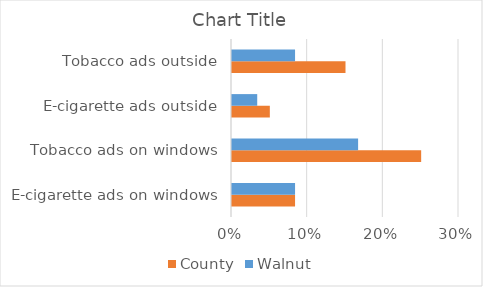
| Category | County | Walnut |
|---|---|---|
| E-cigarette ads on windows | 0.083 | 0.083 |
| Tobacco ads on windows | 0.25 | 0.167 |
| E-cigarette ads outside | 0.05 | 0.033 |
| Tobacco ads outside | 0.15 | 0.083 |